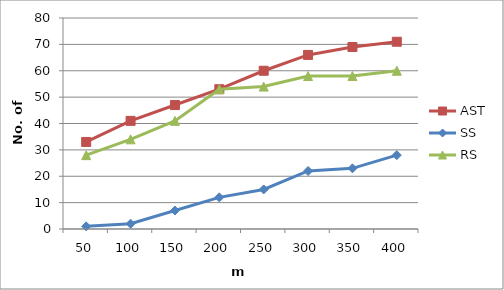
| Category | AST | SS | RS |
|---|---|---|---|
| 50.0 | 33 | 1 | 28 |
| 100.0 | 41 | 2 | 34 |
| 150.0 | 47 | 7 | 41 |
| 200.0 | 53 | 12 | 53 |
| 250.0 | 60 | 15 | 54 |
| 300.0 | 66 | 22 | 58 |
| 350.0 | 69 | 23 | 58 |
| 400.0 | 71 | 28 | 60 |